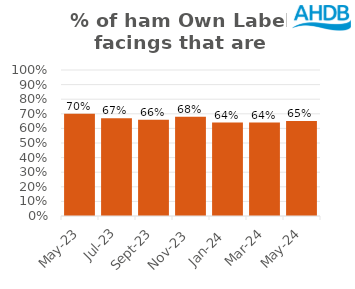
| Category | Ham |
|---|---|
| 2023-05-01 | 0.7 |
| 2023-07-01 | 0.67 |
| 2023-09-01 | 0.66 |
| 2023-11-01 | 0.68 |
| 2024-01-01 | 0.64 |
| 2024-03-01 | 0.64 |
| 2024-05-01 | 0.65 |